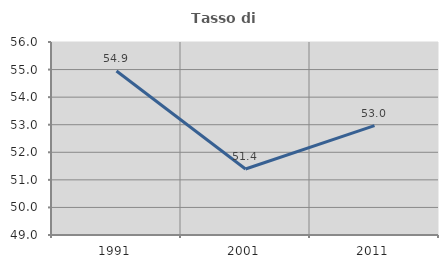
| Category | Tasso di occupazione   |
|---|---|
| 1991.0 | 54.949 |
| 2001.0 | 51.394 |
| 2011.0 | 52.967 |